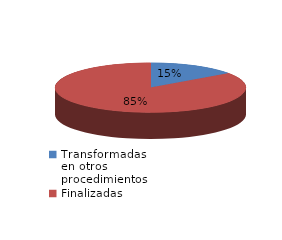
| Category | Series 0 |
|---|---|
| Transformadas en otros procedimientos | 1918 |
| Finalizadas | 10862 |